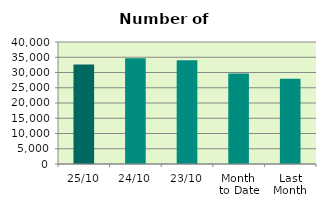
| Category | Series 0 |
|---|---|
| 25/10 | 32598 |
| 24/10 | 34680 |
| 23/10 | 33982 |
| Month 
to Date | 29684.632 |
| Last
Month | 27963.2 |